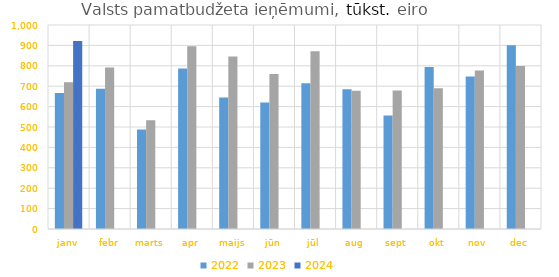
| Category | 2022 | 2023 | 2024 |
|---|---|---|---|
| janv | 666661.352 | 719939.35 | 921874.013 |
| febr | 687779.931 | 791517.955 | 0 |
| marts | 487592.334 | 533224.214 | 0 |
| apr | 787062.79 | 895993.736 | 0 |
| maijs | 644004.073 | 845157.912 | 0 |
| jūn | 620273.485 | 760374.013 | 0 |
| jūl | 713962.301 | 871539.884 | 0 |
| aug | 685067.765 | 678022.747 | 0 |
| sept | 556332.319 | 678643.792 | 0 |
| okt | 794230.202 | 689799.53 | 0 |
| nov | 747989.336 | 777169.422 | 0 |
| dec | 900960.999 | 799044.443 | 0 |